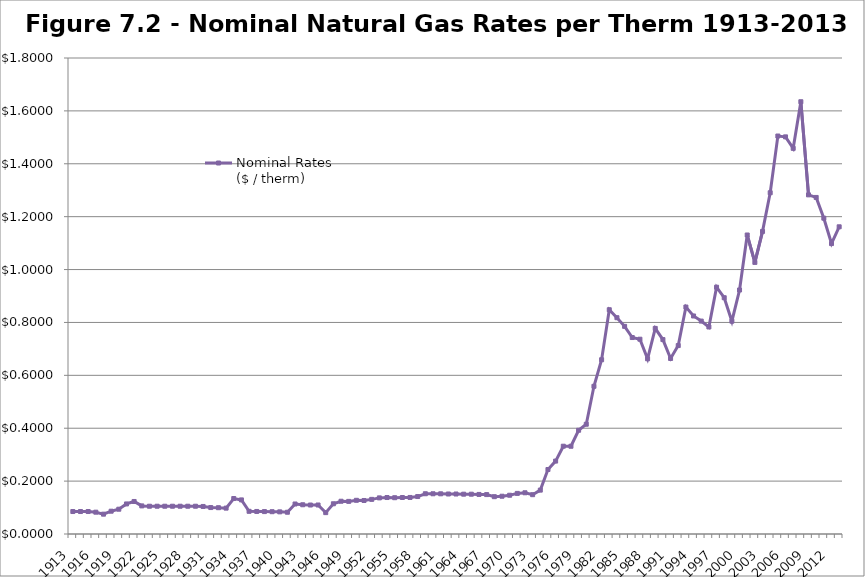
| Category | Nominal Rates 
($ / therm) |
|---|---|
| 1913.0 | 0.085 |
| 1914.0 | 0.085 |
| 1915.0 | 0.085 |
| 1916.0 | 0.082 |
| 1917.0 | 0.075 |
| 1918.0 | 0.086 |
| 1919.0 | 0.094 |
| 1920.0 | 0.114 |
| 1921.0 | 0.123 |
| 1922.0 | 0.106 |
| 1923.0 | 0.105 |
| 1924.0 | 0.105 |
| 1925.0 | 0.105 |
| 1926.0 | 0.105 |
| 1927.0 | 0.105 |
| 1928.0 | 0.105 |
| 1929.0 | 0.105 |
| 1930.0 | 0.104 |
| 1931.0 | 0.1 |
| 1932.0 | 0.099 |
| 1933.0 | 0.098 |
| 1934.0 | 0.134 |
| 1935.0 | 0.129 |
| 1936.0 | 0.086 |
| 1937.0 | 0.085 |
| 1938.0 | 0.085 |
| 1939.0 | 0.084 |
| 1940.0 | 0.084 |
| 1941.0 | 0.082 |
| 1942.0 | 0.113 |
| 1943.0 | 0.111 |
| 1944.0 | 0.11 |
| 1945.0 | 0.11 |
| 1946.0 | 0.081 |
| 1947.0 | 0.114 |
| 1948.0 | 0.124 |
| 1949.0 | 0.123 |
| 1950.0 | 0.127 |
| 1951.0 | 0.127 |
| 1952.0 | 0.131 |
| 1953.0 | 0.137 |
| 1954.0 | 0.138 |
| 1955.0 | 0.137 |
| 1956.0 | 0.138 |
| 1957.0 | 0.138 |
| 1958.0 | 0.142 |
| 1959.0 | 0.152 |
| 1960.0 | 0.152 |
| 1961.0 | 0.152 |
| 1962.0 | 0.151 |
| 1963.0 | 0.151 |
| 1964.0 | 0.151 |
| 1965.0 | 0.15 |
| 1966.0 | 0.15 |
| 1967.0 | 0.149 |
| 1968.0 | 0.141 |
| 1969.0 | 0.143 |
| 1970.0 | 0.147 |
| 1971.0 | 0.154 |
| 1972.0 | 0.156 |
| 1973.0 | 0.149 |
| 1974.0 | 0.166 |
| 1975.0 | 0.244 |
| 1976.0 | 0.276 |
| 1977.0 | 0.332 |
| 1978.0 | 0.332 |
| 1979.0 | 0.392 |
| 1980.0 | 0.415 |
| 1981.0 | 0.559 |
| 1982.0 | 0.659 |
| 1983.0 | 0.848 |
| 1984.0 | 0.818 |
| 1985.0 | 0.785 |
| 1986.0 | 0.743 |
| 1987.0 | 0.737 |
| 1988.0 | 0.663 |
| 1989.0 | 0.777 |
| 1990.0 | 0.735 |
| 1991.0 | 0.664 |
| 1992.0 | 0.713 |
| 1993.0 | 0.858 |
| 1994.0 | 0.824 |
| 1995.0 | 0.805 |
| 1996.0 | 0.783 |
| 1997.0 | 0.933 |
| 1998.0 | 0.893 |
| 1999.0 | 0.805 |
| 2000.0 | 0.923 |
| 2001.0 | 1.131 |
| 2002.0 | 1.027 |
| 2003.0 | 1.144 |
| 2004.0 | 1.29 |
| 2005.0 | 1.505 |
| 2006.0 | 1.502 |
| 2007.0 | 1.458 |
| 2008.0 | 1.635 |
| 2009.0 | 1.282 |
| 2010.0 | 1.273 |
| 2011.0 | 1.194 |
| 2012.0 | 1.098 |
| 2013.0 | 1.162 |